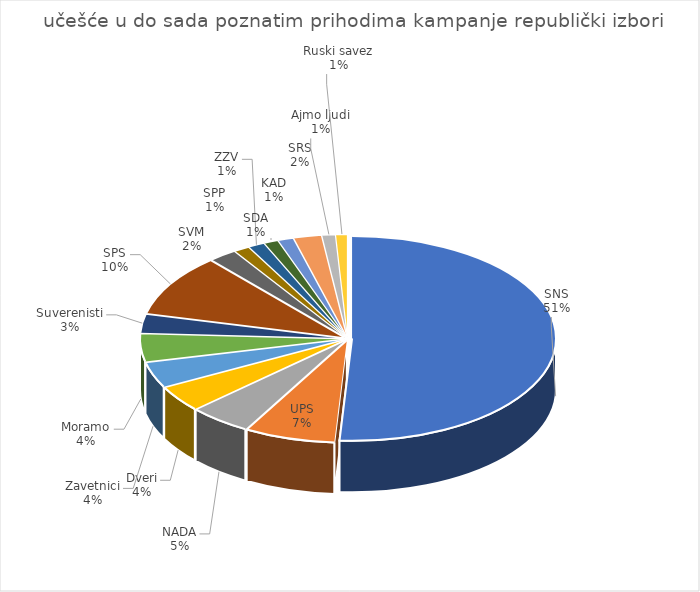
| Category | Series 7 |
|---|---|
| SNS | 9566944.455 |
| UPS | 1349135.96 |
| NADA | 930947.52 |
| Dveri | 780632.403 |
| Zavetnici | 768386.887 |
| Moramo | 832303.222 |
| Suverenisti | 566271.518 |
| SPS | 1833614.152 |
| SVM | 418743.686 |
| SPP | 234872.003 |
| ZZV | 245554.725 |
| SDA | 215348.894 |
| KAD | 231929.997 |
| SRS | 416546.974 |
| Ajmo ljudi | 200495.388 |
| Ruski savez | 174237.392 |